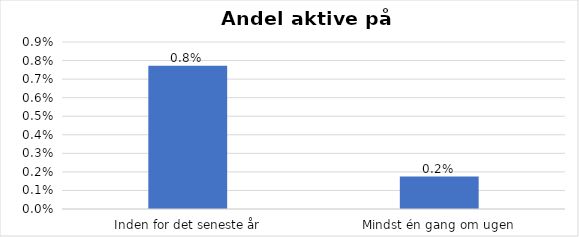
| Category | % |
|---|---|
| Inden for det seneste år | 0.008 |
| Mindst én gang om ugen | 0.002 |